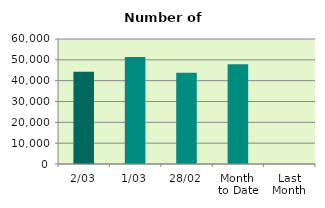
| Category | Series 0 |
|---|---|
| 2/03 | 44310 |
| 1/03 | 51362 |
| 28/02 | 43804 |
| Month 
to Date | 47836 |
| Last
Month | 0 |